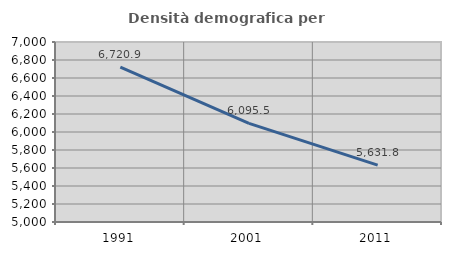
| Category | Densità demografica |
|---|---|
| 1991.0 | 6720.86 |
| 2001.0 | 6095.499 |
| 2011.0 | 5631.786 |